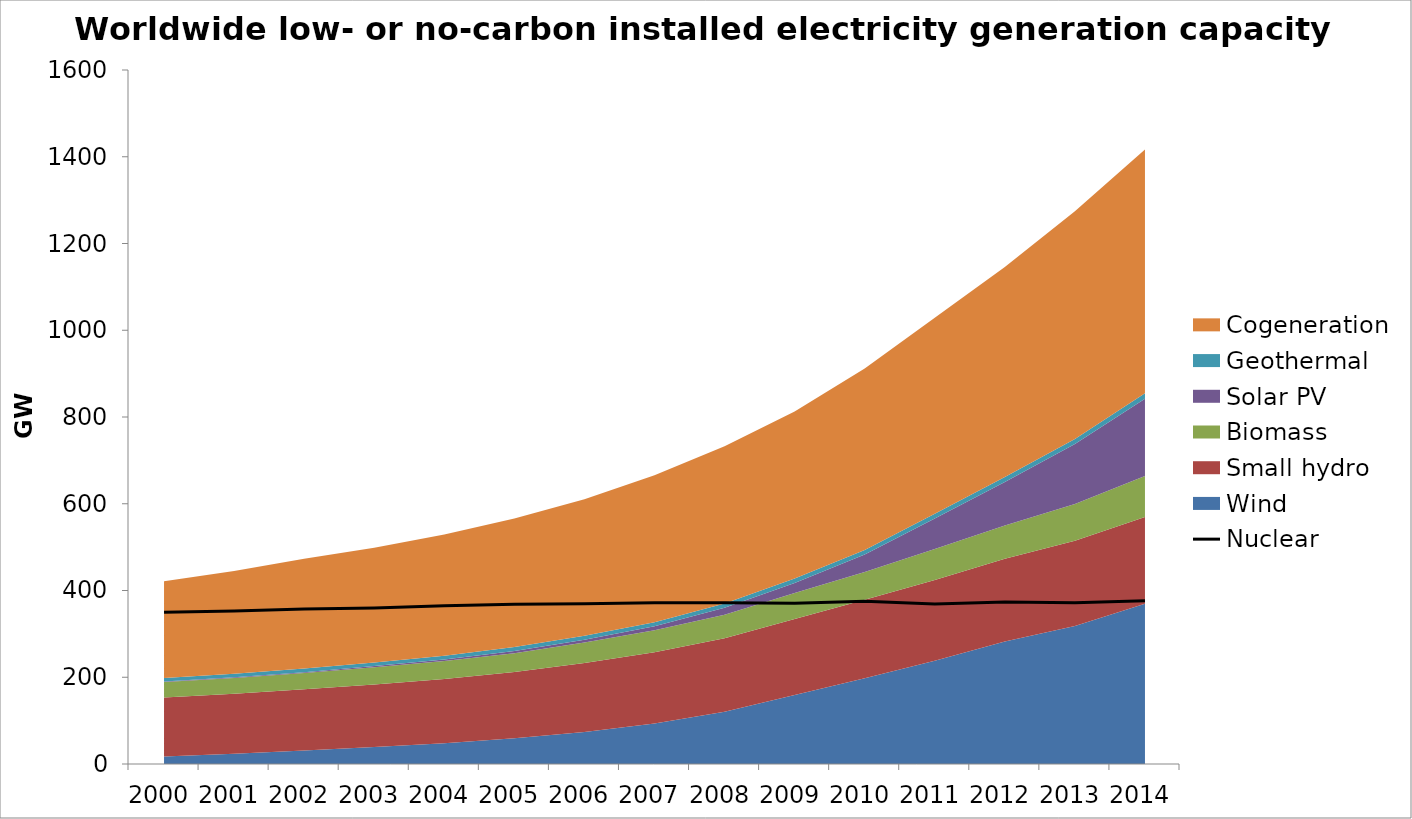
| Category | Nuclear |
|---|---|
| 0 | 349.98 |
| 1 | 352.72 |
| 2 | 357.48 |
| 3 | 359.83 |
| 4 | 364.67 |
| 5 | 368.12 |
| 6 | 369.58 |
| 7 | 371.71 |
| 8 | 371.56 |
| 9 | 370.7 |
| 10 | 375.28 |
| 11 | 368.92 |
| 12 | 373.26 |
| 13 | 371.74 |
| 14 | 376.22 |